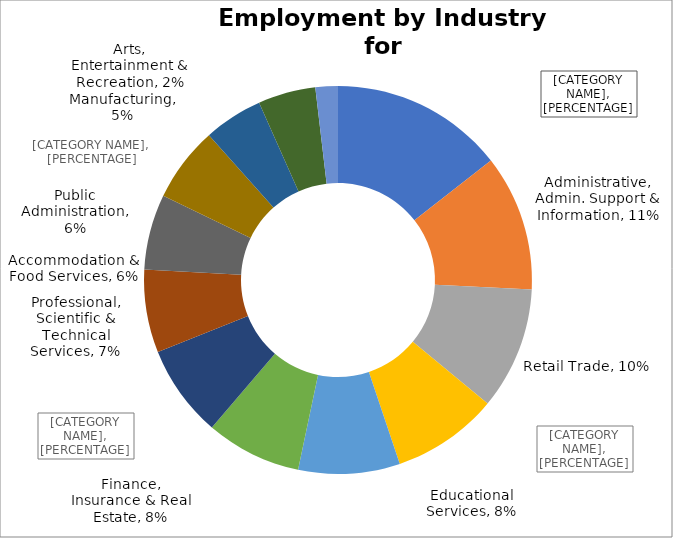
| Category | Series 0 |
|---|---|
| Health Care & Social Assistance | 0.144 |
| Administrative, Admin. Support & Information | 0.113 |
| Retail Trade | 0.102 |
| Transportation, Warehousing & Whsl Trade | 0.088 |
| Educational Services | 0.084 |
| Finance, Insurance & Real Estate | 0.079 |
| Construction, Utilities, Agriculture & Mining | 0.077 |
| Professional, Scientific & Technical Services | 0.069 |
| Accommodation & Food Services | 0.063 |
| Public Administration | 0.063 |
| Business & Personal Services | 0.049 |
| Manufacturing | 0.048 |
| Arts, Entertainment & Recreation | 0.019 |